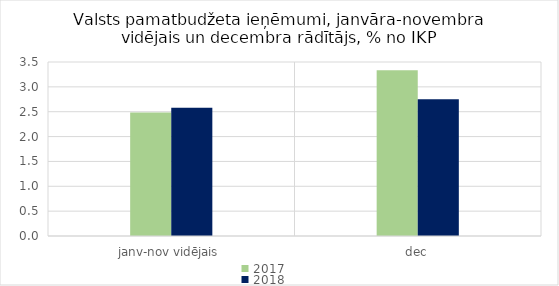
| Category | 2017 | 2018 |
|---|---|---|
| janv-nov vidējais | 2.485 | 2.58 |
| dec | 3.333 | 2.752 |